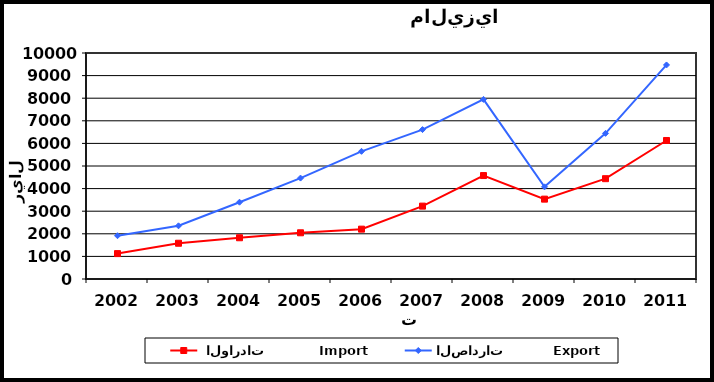
| Category |  الواردات           Import | الصادرات          Export |
|---|---|---|
| 2002.0 | 1124 | 1915 |
| 2003.0 | 1582 | 2354 |
| 2004.0 | 1825 | 3398 |
| 2005.0 | 2045 | 4465 |
| 2006.0 | 2206 | 5649 |
| 2007.0 | 3225 | 6611 |
| 2008.0 | 4577 | 7948 |
| 2009.0 | 3534 | 4078 |
| 2010.0 | 4439 | 6444 |
| 2011.0 | 6129 | 9471 |